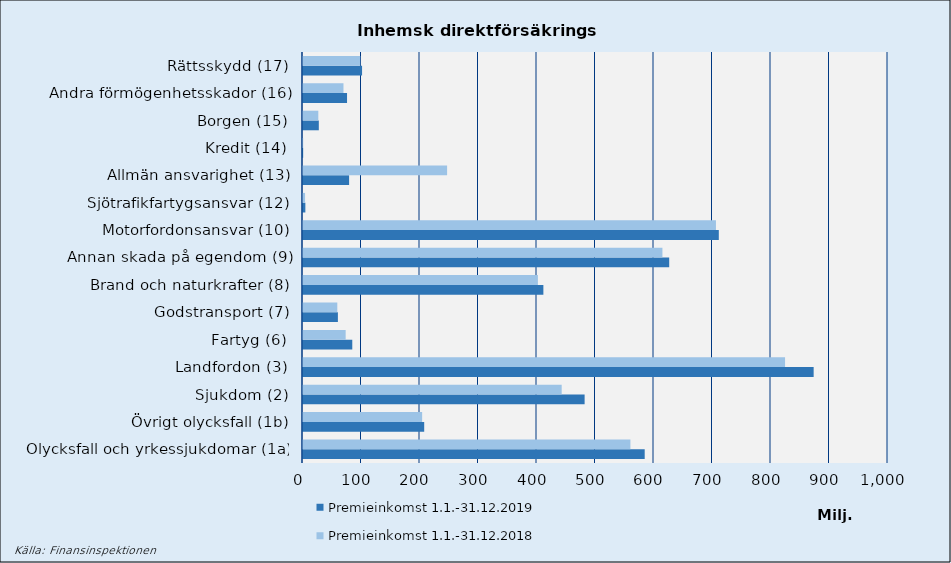
| Category | Premieinkomst |
|---|---|
| Olycksfall och yrkessjukdomar (1a) | 559666.145 |
| Övrigt olycksfall (1b) | 203677.443 |
| Sjukdom (2) | 442195.381 |
| Landfordon (3) | 824036.139 |
| Fartyg (6) | 72920.45 |
| Godstransport (7) | 58636.91 |
| Brand och naturkrafter (8) | 401537.64 |
| Annan skada på egendom (9) | 614407.024 |
| Motorfordonsansvar (10) | 705892.408 |
| Sjötrafikfartygsansvar (12) | 3514.723 |
| Allmän ansvarighet (13) | 246323.511 |
| Kredit (14) | 263.968 |
| Borgen (15) | 26170.212 |
| Andra förmögenhetsskador (16) | 69180.597 |
| Rättsskydd (17) | 97911.11 |